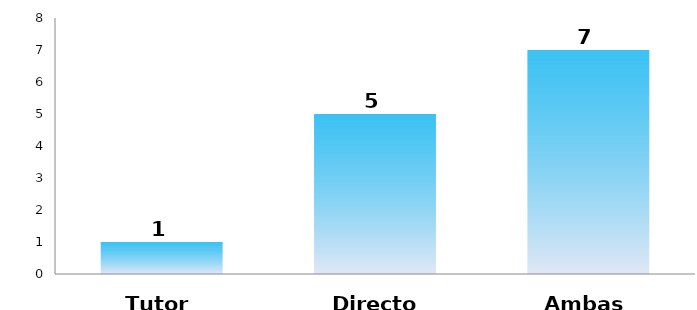
| Category | Series 0 |
|---|---|
| Tutor | 1 |
| Director | 5 |
| Ambas | 7 |